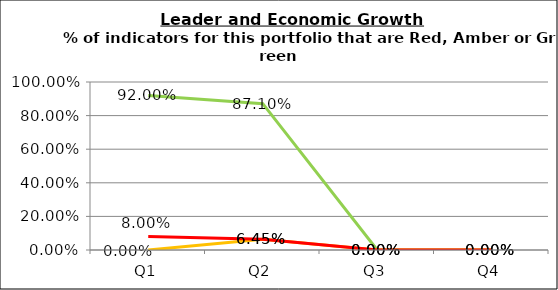
| Category | Green | Amber | Red |
|---|---|---|---|
| Q1 | 0.92 | 0 | 0.08 |
| Q2 | 0.871 | 0.065 | 0.065 |
| Q3 | 0 | 0 | 0 |
| Q4 | 0 | 0 | 0 |